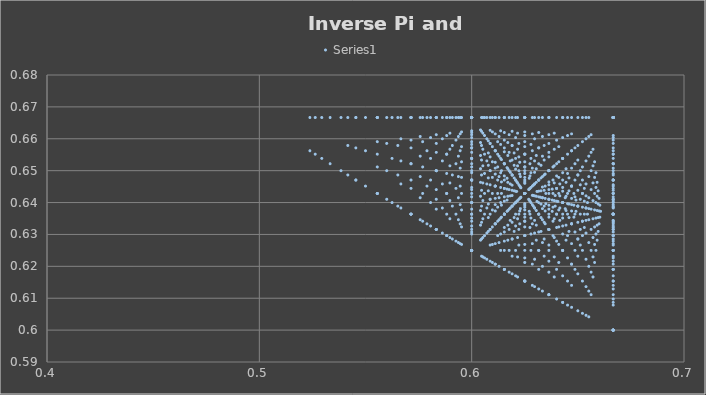
| Category | Series 0 |
|---|---|
| 0.6666666666666666 | 0.6 |
| 0.6 | 0.625 |
| 0.5714285714285714 | 0.636 |
| 0.5555555555555556 | 0.643 |
| 0.5454545454545455 | 0.647 |
| 0.5384615384615384 | 0.65 |
| 0.5333333333333333 | 0.652 |
| 0.5294117647058824 | 0.654 |
| 0.5263157894736842 | 0.655 |
| 0.5238095238095238 | 0.656 |
| 0.6666666666666666 | 0.6 |
| 0.625 | 0.615 |
| 0.6 | 0.625 |
| 0.5833333333333334 | 0.632 |
| 0.5714285714285714 | 0.636 |
| 0.5625 | 0.64 |
| 0.5555555555555556 | 0.643 |
| 0.55 | 0.645 |
| 0.5454545454545455 | 0.647 |
| 0.5416666666666666 | 0.649 |
| 0.6666666666666666 | 0.6 |
| 0.6363636363636364 | 0.611 |
| 0.6153846153846154 | 0.619 |
| 0.6 | 0.625 |
| 0.5882352941176471 | 0.63 |
| 0.5789473684210527 | 0.633 |
| 0.5714285714285714 | 0.636 |
| 0.5652173913043479 | 0.639 |
| 0.5599999999999999 | 0.641 |
| 0.5555555555555556 | 0.643 |
| 0.6666666666666666 | 0.6 |
| 0.6428571428571428 | 0.609 |
| 0.625 | 0.615 |
| 0.611111111111111 | 0.621 |
| 0.6 | 0.625 |
| 0.5909090909090909 | 0.629 |
| 0.5833333333333334 | 0.632 |
| 0.5769230769230769 | 0.634 |
| 0.5714285714285714 | 0.636 |
| 0.5666666666666667 | 0.638 |
| 0.6666666666666666 | 0.6 |
| 0.6470588235294118 | 0.607 |
| 0.6315789473684211 | 0.613 |
| 0.6190476190476191 | 0.618 |
| 0.6086956521739131 | 0.622 |
| 0.6 | 0.625 |
| 0.5925925925925926 | 0.628 |
| 0.5862068965517242 | 0.63 |
| 0.5806451612903225 | 0.633 |
| 0.5757575757575757 | 0.635 |
| 0.6666666666666666 | 0.6 |
| 0.6499999999999999 | 0.606 |
| 0.6363636363636364 | 0.611 |
| 0.625 | 0.615 |
| 0.6153846153846154 | 0.619 |
| 0.6071428571428572 | 0.622 |
| 0.6 | 0.625 |
| 0.59375 | 0.627 |
| 0.5882352941176471 | 0.63 |
| 0.5833333333333334 | 0.632 |
| 0.6666666666666666 | 0.6 |
| 0.6521739130434783 | 0.605 |
| 0.64 | 0.61 |
| 0.6296296296296297 | 0.614 |
| 0.6206896551724138 | 0.617 |
| 0.6129032258064516 | 0.62 |
| 0.6060606060606061 | 0.623 |
| 0.6 | 0.625 |
| 0.5945945945945946 | 0.627 |
| 0.5897435897435898 | 0.629 |
| 0.6666666666666666 | 0.6 |
| 0.6538461538461539 | 0.605 |
| 0.6428571428571428 | 0.609 |
| 0.6333333333333333 | 0.612 |
| 0.625 | 0.615 |
| 0.6176470588235294 | 0.618 |
| 0.611111111111111 | 0.621 |
| 0.6052631578947368 | 0.623 |
| 0.6 | 0.625 |
| 0.5952380952380952 | 0.627 |
| 0.6666666666666666 | 0.6 |
| 0.6551724137931034 | 0.604 |
| 0.6451612903225806 | 0.608 |
| 0.6363636363636364 | 0.611 |
| 0.6285714285714286 | 0.614 |
| 0.6216216216216216 | 0.617 |
| 0.6153846153846154 | 0.619 |
| 0.6097560975609756 | 0.621 |
| 0.6046511627906977 | 0.623 |
| 0.6 | 0.625 |
| 0.6666666666666666 | 0.667 |
| 0.6 | 0.667 |
| 0.5714285714285714 | 0.667 |
| 0.5555555555555556 | 0.667 |
| 0.5454545454545455 | 0.667 |
| 0.5384615384615384 | 0.667 |
| 0.5333333333333333 | 0.667 |
| 0.5294117647058824 | 0.667 |
| 0.5263157894736842 | 0.667 |
| 0.5238095238095238 | 0.667 |
| 0.6666666666666666 | 0.636 |
| 0.625 | 0.643 |
| 0.6 | 0.647 |
| 0.5833333333333334 | 0.65 |
| 0.5714285714285714 | 0.652 |
| 0.5625 | 0.654 |
| 0.5555555555555556 | 0.655 |
| 0.55 | 0.656 |
| 0.5454545454545455 | 0.657 |
| 0.5416666666666666 | 0.658 |
| 0.6666666666666666 | 0.625 |
| 0.6363636363636364 | 0.632 |
| 0.6153846153846154 | 0.636 |
| 0.6 | 0.64 |
| 0.5882352941176471 | 0.643 |
| 0.5789473684210527 | 0.645 |
| 0.5714285714285714 | 0.647 |
| 0.5652173913043479 | 0.649 |
| 0.5599999999999999 | 0.65 |
| 0.5555555555555556 | 0.651 |
| 0.6666666666666666 | 0.619 |
| 0.6428571428571428 | 0.625 |
| 0.625 | 0.63 |
| 0.611111111111111 | 0.633 |
| 0.6 | 0.636 |
| 0.5909090909090909 | 0.639 |
| 0.5833333333333334 | 0.641 |
| 0.5769230769230769 | 0.643 |
| 0.5714285714285714 | 0.644 |
| 0.5666666666666667 | 0.646 |
| 0.6666666666666666 | 0.615 |
| 0.6470588235294118 | 0.621 |
| 0.6315789473684211 | 0.625 |
| 0.6190476190476191 | 0.629 |
| 0.6086956521739131 | 0.632 |
| 0.6 | 0.634 |
| 0.5925925925925926 | 0.636 |
| 0.5862068965517242 | 0.638 |
| 0.5806451612903225 | 0.64 |
| 0.5757575757575757 | 0.642 |
| 0.6666666666666666 | 0.613 |
| 0.6499999999999999 | 0.618 |
| 0.6363636363636364 | 0.622 |
| 0.625 | 0.625 |
| 0.6153846153846154 | 0.628 |
| 0.6071428571428572 | 0.63 |
| 0.6 | 0.633 |
| 0.59375 | 0.635 |
| 0.5882352941176471 | 0.636 |
| 0.5833333333333334 | 0.638 |
| 0.6666666666666666 | 0.611 |
| 0.6521739130434783 | 0.615 |
| 0.64 | 0.619 |
| 0.6296296296296297 | 0.622 |
| 0.6206896551724138 | 0.625 |
| 0.6129032258064516 | 0.627 |
| 0.6060606060606061 | 0.63 |
| 0.6 | 0.632 |
| 0.5945945945945946 | 0.633 |
| 0.5897435897435898 | 0.635 |
| 0.6666666666666666 | 0.61 |
| 0.6538461538461539 | 0.614 |
| 0.6428571428571428 | 0.617 |
| 0.6333333333333333 | 0.62 |
| 0.625 | 0.623 |
| 0.6176470588235294 | 0.625 |
| 0.611111111111111 | 0.627 |
| 0.6052631578947368 | 0.629 |
| 0.6 | 0.631 |
| 0.5952380952380952 | 0.632 |
| 0.6666666666666666 | 0.609 |
| 0.6551724137931034 | 0.612 |
| 0.6451612903225806 | 0.615 |
| 0.6363636363636364 | 0.618 |
| 0.6285714285714286 | 0.621 |
| 0.6216216216216216 | 0.623 |
| 0.6153846153846154 | 0.625 |
| 0.6097560975609756 | 0.627 |
| 0.6046511627906977 | 0.629 |
| 0.6 | 0.63 |
| 0.6666666666666666 | 0.608 |
| 0.65625 | 0.611 |
| 0.6470588235294118 | 0.614 |
| 0.6388888888888888 | 0.617 |
| 0.6315789473684211 | 0.619 |
| 0.625 | 0.621 |
| 0.6190476190476191 | 0.623 |
| 0.6136363636363636 | 0.625 |
| 0.6086956521739131 | 0.627 |
| 0.6041666666666666 | 0.628 |
| 0.6666666666666666 | 0.667 |
| 0.625 | 0.667 |
| 0.6 | 0.667 |
| 0.5833333333333334 | 0.667 |
| 0.5714285714285714 | 0.667 |
| 0.5625 | 0.667 |
| 0.5555555555555556 | 0.667 |
| 0.55 | 0.667 |
| 0.5454545454545455 | 0.667 |
| 0.5416666666666666 | 0.667 |
| 0.6666666666666666 | 0.647 |
| 0.6363636363636364 | 0.65 |
| 0.6153846153846154 | 0.652 |
| 0.6 | 0.654 |
| 0.5882352941176471 | 0.655 |
| 0.5789473684210527 | 0.656 |
| 0.5714285714285714 | 0.657 |
| 0.5652173913043479 | 0.658 |
| 0.5599999999999999 | 0.659 |
| 0.5555555555555556 | 0.659 |
| 0.6666666666666666 | 0.636 |
| 0.6428571428571428 | 0.64 |
| 0.625 | 0.643 |
| 0.611111111111111 | 0.645 |
| 0.6 | 0.647 |
| 0.5909090909090909 | 0.649 |
| 0.5833333333333334 | 0.65 |
| 0.5769230769230769 | 0.651 |
| 0.5714285714285714 | 0.652 |
| 0.5666666666666667 | 0.653 |
| 0.6666666666666666 | 0.63 |
| 0.6470588235294118 | 0.633 |
| 0.6315789473684211 | 0.636 |
| 0.6190476190476191 | 0.639 |
| 0.6086956521739131 | 0.641 |
| 0.6 | 0.643 |
| 0.5925925925925926 | 0.644 |
| 0.5862068965517242 | 0.646 |
| 0.5806451612903225 | 0.647 |
| 0.5757575757575757 | 0.648 |
| 0.6666666666666666 | 0.625 |
| 0.6499999999999999 | 0.629 |
| 0.6363636363636364 | 0.632 |
| 0.625 | 0.634 |
| 0.6153846153846154 | 0.636 |
| 0.6071428571428572 | 0.638 |
| 0.6 | 0.64 |
| 0.59375 | 0.642 |
| 0.5882352941176471 | 0.643 |
| 0.5833333333333334 | 0.644 |
| 0.6666666666666666 | 0.622 |
| 0.6521739130434783 | 0.625 |
| 0.64 | 0.628 |
| 0.6296296296296297 | 0.63 |
| 0.6206896551724138 | 0.633 |
| 0.6129032258064516 | 0.635 |
| 0.6060606060606061 | 0.636 |
| 0.6 | 0.638 |
| 0.5945945945945946 | 0.639 |
| 0.5897435897435898 | 0.641 |
| 0.6666666666666666 | 0.619 |
| 0.6538461538461539 | 0.622 |
| 0.6428571428571428 | 0.625 |
| 0.6333333333333333 | 0.627 |
| 0.625 | 0.63 |
| 0.6176470588235294 | 0.632 |
| 0.611111111111111 | 0.633 |
| 0.6052631578947368 | 0.635 |
| 0.6 | 0.636 |
| 0.5952380952380952 | 0.638 |
| 0.6666666666666666 | 0.617 |
| 0.6551724137931034 | 0.62 |
| 0.6451612903225806 | 0.623 |
| 0.6363636363636364 | 0.625 |
| 0.6285714285714286 | 0.627 |
| 0.6216216216216216 | 0.629 |
| 0.6153846153846154 | 0.631 |
| 0.6097560975609756 | 0.632 |
| 0.6046511627906977 | 0.634 |
| 0.6 | 0.635 |
| 0.6666666666666666 | 0.615 |
| 0.65625 | 0.618 |
| 0.6470588235294118 | 0.621 |
| 0.6388888888888888 | 0.623 |
| 0.6315789473684211 | 0.625 |
| 0.625 | 0.627 |
| 0.6190476190476191 | 0.629 |
| 0.6136363636363636 | 0.63 |
| 0.6086956521739131 | 0.632 |
| 0.6041666666666666 | 0.633 |
| 0.6666666666666666 | 0.614 |
| 0.6571428571428571 | 0.617 |
| 0.6486486486486486 | 0.619 |
| 0.641025641025641 | 0.621 |
| 0.6341463414634146 | 0.623 |
| 0.627906976744186 | 0.625 |
| 0.6222222222222222 | 0.627 |
| 0.6170212765957447 | 0.628 |
| 0.6122448979591837 | 0.63 |
| 0.6078431372549019 | 0.631 |
| 0.6666666666666666 | 0.667 |
| 0.6363636363636364 | 0.667 |
| 0.6153846153846154 | 0.667 |
| 0.6 | 0.667 |
| 0.5882352941176471 | 0.667 |
| 0.5789473684210527 | 0.667 |
| 0.5714285714285714 | 0.667 |
| 0.5652173913043479 | 0.667 |
| 0.5599999999999999 | 0.667 |
| 0.5555555555555556 | 0.667 |
| 0.6666666666666666 | 0.652 |
| 0.6428571428571428 | 0.654 |
| 0.625 | 0.655 |
| 0.611111111111111 | 0.656 |
| 0.6 | 0.657 |
| 0.5909090909090909 | 0.658 |
| 0.5833333333333334 | 0.659 |
| 0.5769230769230769 | 0.659 |
| 0.5714285714285714 | 0.66 |
| 0.5666666666666667 | 0.66 |
| 0.6666666666666666 | 0.643 |
| 0.6470588235294118 | 0.645 |
| 0.6315789473684211 | 0.647 |
| 0.6190476190476191 | 0.649 |
| 0.6086956521739131 | 0.65 |
| 0.6 | 0.651 |
| 0.5925925925925926 | 0.652 |
| 0.5862068965517242 | 0.653 |
| 0.5806451612903225 | 0.654 |
| 0.5757575757575757 | 0.655 |
| 0.6666666666666666 | 0.636 |
| 0.6499999999999999 | 0.639 |
| 0.6363636363636364 | 0.641 |
| 0.625 | 0.643 |
| 0.6153846153846154 | 0.644 |
| 0.6071428571428572 | 0.646 |
| 0.6 | 0.647 |
| 0.59375 | 0.648 |
| 0.5882352941176471 | 0.649 |
| 0.5833333333333334 | 0.65 |
| 0.6666666666666666 | 0.632 |
| 0.6521739130434783 | 0.634 |
| 0.64 | 0.636 |
| 0.6296296296296297 | 0.638 |
| 0.6206896551724138 | 0.64 |
| 0.6129032258064516 | 0.642 |
| 0.6060606060606061 | 0.643 |
| 0.6 | 0.644 |
| 0.5945945945945946 | 0.645 |
| 0.5897435897435898 | 0.646 |
| 0.6666666666666666 | 0.628 |
| 0.6538461538461539 | 0.63 |
| 0.6428571428571428 | 0.633 |
| 0.6333333333333333 | 0.635 |
| 0.625 | 0.636 |
| 0.6176470588235294 | 0.638 |
| 0.611111111111111 | 0.639 |
| 0.6052631578947368 | 0.641 |
| 0.6 | 0.642 |
| 0.5952380952380952 | 0.643 |
| 0.6666666666666666 | 0.625 |
| 0.6551724137931034 | 0.627 |
| 0.6451612903225806 | 0.63 |
| 0.6363636363636364 | 0.632 |
| 0.6285714285714286 | 0.633 |
| 0.6216216216216216 | 0.635 |
| 0.6153846153846154 | 0.636 |
| 0.6097560975609756 | 0.638 |
| 0.6046511627906977 | 0.639 |
| 0.6 | 0.64 |
| 0.6666666666666666 | 0.623 |
| 0.65625 | 0.625 |
| 0.6470588235294118 | 0.627 |
| 0.6388888888888888 | 0.629 |
| 0.6315789473684211 | 0.631 |
| 0.625 | 0.632 |
| 0.6190476190476191 | 0.634 |
| 0.6136363636363636 | 0.635 |
| 0.6086956521739131 | 0.636 |
| 0.6041666666666666 | 0.638 |
| 0.6666666666666666 | 0.621 |
| 0.6571428571428571 | 0.623 |
| 0.6486486486486486 | 0.625 |
| 0.641025641025641 | 0.627 |
| 0.6341463414634146 | 0.629 |
| 0.627906976744186 | 0.63 |
| 0.6222222222222222 | 0.632 |
| 0.6170212765957447 | 0.633 |
| 0.6122448979591837 | 0.634 |
| 0.6078431372549019 | 0.635 |
| 0.6666666666666666 | 0.619 |
| 0.6578947368421053 | 0.621 |
| 0.6499999999999999 | 0.623 |
| 0.6428571428571428 | 0.625 |
| 0.6363636363636364 | 0.627 |
| 0.6304347826086957 | 0.628 |
| 0.625 | 0.63 |
| 0.62 | 0.631 |
| 0.6153846153846154 | 0.632 |
| 0.611111111111111 | 0.633 |
| 0.6666666666666666 | 0.667 |
| 0.6428571428571428 | 0.667 |
| 0.625 | 0.667 |
| 0.611111111111111 | 0.667 |
| 0.6 | 0.667 |
| 0.5909090909090909 | 0.667 |
| 0.5833333333333334 | 0.667 |
| 0.5769230769230769 | 0.667 |
| 0.5714285714285714 | 0.667 |
| 0.5666666666666667 | 0.667 |
| 0.6666666666666666 | 0.655 |
| 0.6470588235294118 | 0.656 |
| 0.6315789473684211 | 0.657 |
| 0.6190476190476191 | 0.658 |
| 0.6086956521739131 | 0.659 |
| 0.6 | 0.659 |
| 0.5925925925925926 | 0.66 |
| 0.5862068965517242 | 0.66 |
| 0.5806451612903225 | 0.66 |
| 0.5757575757575757 | 0.661 |
| 0.6666666666666666 | 0.647 |
| 0.6499999999999999 | 0.649 |
| 0.6363636363636364 | 0.65 |
| 0.625 | 0.651 |
| 0.6153846153846154 | 0.652 |
| 0.6071428571428572 | 0.653 |
| 0.6 | 0.654 |
| 0.59375 | 0.655 |
| 0.5882352941176471 | 0.655 |
| 0.5833333333333334 | 0.656 |
| 0.6666666666666666 | 0.641 |
| 0.6521739130434783 | 0.643 |
| 0.64 | 0.644 |
| 0.6296296296296297 | 0.646 |
| 0.6206896551724138 | 0.647 |
| 0.6129032258064516 | 0.648 |
| 0.6060606060606061 | 0.649 |
| 0.6 | 0.65 |
| 0.5945945945945946 | 0.651 |
| 0.5897435897435898 | 0.652 |
| 0.6666666666666666 | 0.636 |
| 0.6538461538461539 | 0.638 |
| 0.6428571428571428 | 0.64 |
| 0.6333333333333333 | 0.642 |
| 0.625 | 0.643 |
| 0.6176470588235294 | 0.644 |
| 0.611111111111111 | 0.645 |
| 0.6052631578947368 | 0.646 |
| 0.6 | 0.647 |
| 0.5952380952380952 | 0.648 |
| 0.6666666666666666 | 0.633 |
| 0.6551724137931034 | 0.635 |
| 0.6451612903225806 | 0.636 |
| 0.6363636363636364 | 0.638 |
| 0.6285714285714286 | 0.639 |
| 0.6216216216216216 | 0.641 |
| 0.6153846153846154 | 0.642 |
| 0.6097560975609756 | 0.643 |
| 0.6046511627906977 | 0.644 |
| 0.6 | 0.645 |
| 0.6666666666666666 | 0.63 |
| 0.65625 | 0.632 |
| 0.6470588235294118 | 0.633 |
| 0.6388888888888888 | 0.635 |
| 0.6315789473684211 | 0.636 |
| 0.625 | 0.638 |
| 0.6190476190476191 | 0.639 |
| 0.6136363636363636 | 0.64 |
| 0.6086956521739131 | 0.641 |
| 0.6041666666666666 | 0.642 |
| 0.6666666666666666 | 0.627 |
| 0.6571428571428571 | 0.629 |
| 0.6486486486486486 | 0.631 |
| 0.641025641025641 | 0.632 |
| 0.6341463414634146 | 0.634 |
| 0.627906976744186 | 0.635 |
| 0.6222222222222222 | 0.636 |
| 0.6170212765957447 | 0.638 |
| 0.6122448979591837 | 0.639 |
| 0.6078431372549019 | 0.64 |
| 0.6666666666666666 | 0.625 |
| 0.6578947368421053 | 0.627 |
| 0.6499999999999999 | 0.629 |
| 0.6428571428571428 | 0.63 |
| 0.6363636363636364 | 0.632 |
| 0.6304347826086957 | 0.633 |
| 0.625 | 0.634 |
| 0.62 | 0.635 |
| 0.6153846153846154 | 0.636 |
| 0.611111111111111 | 0.637 |
| 0.6666666666666666 | 0.623 |
| 0.6585365853658536 | 0.625 |
| 0.6511627906976744 | 0.627 |
| 0.6444444444444445 | 0.628 |
| 0.6382978723404256 | 0.63 |
| 0.6326530612244898 | 0.631 |
| 0.6274509803921569 | 0.632 |
| 0.6226415094339623 | 0.633 |
| 0.6181818181818182 | 0.634 |
| 0.6140350877192983 | 0.635 |
| 0.6666666666666666 | 0.667 |
| 0.6470588235294118 | 0.667 |
| 0.6315789473684211 | 0.667 |
| 0.6190476190476191 | 0.667 |
| 0.6086956521739131 | 0.667 |
| 0.6 | 0.667 |
| 0.5925925925925926 | 0.667 |
| 0.5862068965517242 | 0.667 |
| 0.5806451612903225 | 0.667 |
| 0.5757575757575757 | 0.667 |
| 0.6666666666666666 | 0.657 |
| 0.6499999999999999 | 0.658 |
| 0.6363636363636364 | 0.659 |
| 0.625 | 0.659 |
| 0.6153846153846154 | 0.66 |
| 0.6071428571428572 | 0.66 |
| 0.6 | 0.66 |
| 0.59375 | 0.661 |
| 0.5882352941176471 | 0.661 |
| 0.5833333333333334 | 0.661 |
| 0.6666666666666666 | 0.65 |
| 0.6521739130434783 | 0.651 |
| 0.64 | 0.652 |
| 0.6296296296296297 | 0.653 |
| 0.6206896551724138 | 0.654 |
| 0.6129032258064516 | 0.655 |
| 0.6060606060606061 | 0.655 |
| 0.6 | 0.656 |
| 0.5945945945945946 | 0.656 |
| 0.5897435897435898 | 0.657 |
| 0.6666666666666666 | 0.644 |
| 0.6538461538461539 | 0.646 |
| 0.6428571428571428 | 0.647 |
| 0.6333333333333333 | 0.648 |
| 0.625 | 0.649 |
| 0.6176470588235294 | 0.65 |
| 0.611111111111111 | 0.651 |
| 0.6052631578947368 | 0.652 |
| 0.6 | 0.652 |
| 0.5952380952380952 | 0.653 |
| 0.6666666666666666 | 0.64 |
| 0.6551724137931034 | 0.642 |
| 0.6451612903225806 | 0.643 |
| 0.6363636363636364 | 0.644 |
| 0.6285714285714286 | 0.645 |
| 0.6216216216216216 | 0.646 |
| 0.6153846153846154 | 0.647 |
| 0.6097560975609756 | 0.648 |
| 0.6046511627906977 | 0.649 |
| 0.6 | 0.649 |
| 0.6666666666666666 | 0.636 |
| 0.65625 | 0.638 |
| 0.6470588235294118 | 0.639 |
| 0.6388888888888888 | 0.641 |
| 0.6315789473684211 | 0.642 |
| 0.625 | 0.643 |
| 0.6190476190476191 | 0.644 |
| 0.6136363636363636 | 0.645 |
| 0.6086956521739131 | 0.646 |
| 0.6041666666666666 | 0.646 |
| 0.6666666666666666 | 0.633 |
| 0.6571428571428571 | 0.635 |
| 0.6486486486486486 | 0.636 |
| 0.641025641025641 | 0.638 |
| 0.6341463414634146 | 0.639 |
| 0.627906976744186 | 0.64 |
| 0.6222222222222222 | 0.641 |
| 0.6170212765957447 | 0.642 |
| 0.6122448979591837 | 0.643 |
| 0.6078431372549019 | 0.644 |
| 0.6666666666666666 | 0.631 |
| 0.6578947368421053 | 0.632 |
| 0.6499999999999999 | 0.634 |
| 0.6428571428571428 | 0.635 |
| 0.6363636363636364 | 0.636 |
| 0.6304347826086957 | 0.638 |
| 0.625 | 0.639 |
| 0.62 | 0.64 |
| 0.6153846153846154 | 0.64 |
| 0.611111111111111 | 0.641 |
| 0.6666666666666666 | 0.629 |
| 0.6585365853658536 | 0.63 |
| 0.6511627906976744 | 0.632 |
| 0.6444444444444445 | 0.633 |
| 0.6382978723404256 | 0.634 |
| 0.6326530612244898 | 0.635 |
| 0.6274509803921569 | 0.636 |
| 0.6226415094339623 | 0.637 |
| 0.6181818181818182 | 0.638 |
| 0.6140350877192983 | 0.639 |
| 0.6666666666666666 | 0.627 |
| 0.6590909090909092 | 0.628 |
| 0.6521739130434783 | 0.63 |
| 0.6458333333333334 | 0.631 |
| 0.64 | 0.632 |
| 0.6346153846153847 | 0.633 |
| 0.6296296296296297 | 0.634 |
| 0.625 | 0.635 |
| 0.6206896551724138 | 0.636 |
| 0.6166666666666666 | 0.637 |
| 0.6666666666666666 | 0.667 |
| 0.6499999999999999 | 0.667 |
| 0.6363636363636364 | 0.667 |
| 0.625 | 0.667 |
| 0.6153846153846154 | 0.667 |
| 0.6071428571428572 | 0.667 |
| 0.6 | 0.667 |
| 0.59375 | 0.667 |
| 0.5882352941176471 | 0.667 |
| 0.5833333333333334 | 0.667 |
| 0.6666666666666666 | 0.659 |
| 0.6521739130434783 | 0.659 |
| 0.64 | 0.66 |
| 0.6296296296296297 | 0.66 |
| 0.6206896551724138 | 0.66 |
| 0.6129032258064516 | 0.661 |
| 0.6060606060606061 | 0.661 |
| 0.6 | 0.661 |
| 0.5945945945945946 | 0.662 |
| 0.5897435897435898 | 0.662 |
| 0.6666666666666666 | 0.652 |
| 0.6538461538461539 | 0.653 |
| 0.6428571428571428 | 0.654 |
| 0.6333333333333333 | 0.655 |
| 0.625 | 0.655 |
| 0.6176470588235294 | 0.656 |
| 0.611111111111111 | 0.656 |
| 0.6052631578947368 | 0.657 |
| 0.6 | 0.657 |
| 0.5952380952380952 | 0.658 |
| 0.6666666666666666 | 0.647 |
| 0.6551724137931034 | 0.648 |
| 0.6451612903225806 | 0.649 |
| 0.6363636363636364 | 0.65 |
| 0.6285714285714286 | 0.651 |
| 0.6216216216216216 | 0.652 |
| 0.6153846153846154 | 0.652 |
| 0.6097560975609756 | 0.653 |
| 0.6046511627906977 | 0.653 |
| 0.6 | 0.654 |
| 0.6666666666666666 | 0.643 |
| 0.65625 | 0.644 |
| 0.6470588235294118 | 0.645 |
| 0.6388888888888888 | 0.646 |
| 0.6315789473684211 | 0.647 |
| 0.625 | 0.648 |
| 0.6190476190476191 | 0.649 |
| 0.6136363636363636 | 0.649 |
| 0.6086956521739131 | 0.65 |
| 0.6041666666666666 | 0.651 |
| 0.6666666666666666 | 0.639 |
| 0.6571428571428571 | 0.641 |
| 0.6486486486486486 | 0.642 |
| 0.641025641025641 | 0.643 |
| 0.6341463414634146 | 0.644 |
| 0.627906976744186 | 0.645 |
| 0.6222222222222222 | 0.646 |
| 0.6170212765957447 | 0.646 |
| 0.6122448979591837 | 0.647 |
| 0.6078431372549019 | 0.648 |
| 0.6666666666666666 | 0.636 |
| 0.6578947368421053 | 0.638 |
| 0.6499999999999999 | 0.639 |
| 0.6428571428571428 | 0.64 |
| 0.6363636363636364 | 0.641 |
| 0.6304347826086957 | 0.642 |
| 0.625 | 0.643 |
| 0.62 | 0.644 |
| 0.6153846153846154 | 0.644 |
| 0.611111111111111 | 0.645 |
| 0.6666666666666666 | 0.634 |
| 0.6585365853658536 | 0.635 |
| 0.6511627906976744 | 0.636 |
| 0.6444444444444445 | 0.638 |
| 0.6382978723404256 | 0.639 |
| 0.6326530612244898 | 0.64 |
| 0.6274509803921569 | 0.64 |
| 0.6226415094339623 | 0.641 |
| 0.6181818181818182 | 0.642 |
| 0.6140350877192983 | 0.643 |
| 0.6666666666666666 | 0.632 |
| 0.6590909090909092 | 0.633 |
| 0.6521739130434783 | 0.634 |
| 0.6458333333333334 | 0.635 |
| 0.64 | 0.636 |
| 0.6346153846153847 | 0.637 |
| 0.6296296296296297 | 0.638 |
| 0.625 | 0.639 |
| 0.6206896551724138 | 0.64 |
| 0.6166666666666666 | 0.641 |
| 0.6666666666666666 | 0.63 |
| 0.6595744680851063 | 0.631 |
| 0.6530612244897959 | 0.632 |
| 0.6470588235294118 | 0.633 |
| 0.6415094339622641 | 0.634 |
| 0.6363636363636364 | 0.635 |
| 0.6315789473684211 | 0.636 |
| 0.6271186440677966 | 0.637 |
| 0.6229508196721311 | 0.638 |
| 0.6190476190476191 | 0.639 |
| 0.6666666666666666 | 0.667 |
| 0.6521739130434783 | 0.667 |
| 0.64 | 0.667 |
| 0.6296296296296297 | 0.667 |
| 0.6206896551724138 | 0.667 |
| 0.6129032258064516 | 0.667 |
| 0.6060606060606061 | 0.667 |
| 0.6 | 0.667 |
| 0.5945945945945946 | 0.667 |
| 0.5897435897435898 | 0.667 |
| 0.6666666666666666 | 0.66 |
| 0.6538461538461539 | 0.66 |
| 0.6428571428571428 | 0.66 |
| 0.6333333333333333 | 0.661 |
| 0.625 | 0.661 |
| 0.6176470588235294 | 0.661 |
| 0.611111111111111 | 0.662 |
| 0.6052631578947368 | 0.662 |
| 0.6 | 0.662 |
| 0.5952380952380952 | 0.662 |
| 0.6666666666666666 | 0.654 |
| 0.6551724137931034 | 0.655 |
| 0.6451612903225806 | 0.655 |
| 0.6363636363636364 | 0.656 |
| 0.6285714285714286 | 0.656 |
| 0.6216216216216216 | 0.657 |
| 0.6153846153846154 | 0.657 |
| 0.6097560975609756 | 0.658 |
| 0.6046511627906977 | 0.658 |
| 0.6 | 0.658 |
| 0.6666666666666666 | 0.649 |
| 0.65625 | 0.65 |
| 0.6470588235294118 | 0.651 |
| 0.6388888888888888 | 0.652 |
| 0.6315789473684211 | 0.652 |
| 0.625 | 0.653 |
| 0.6190476190476191 | 0.653 |
| 0.6136363636363636 | 0.654 |
| 0.6086956521739131 | 0.654 |
| 0.6041666666666666 | 0.655 |
| 0.6666666666666666 | 0.645 |
| 0.6571428571428571 | 0.646 |
| 0.6486486486486486 | 0.647 |
| 0.641025641025641 | 0.648 |
| 0.6341463414634146 | 0.649 |
| 0.627906976744186 | 0.649 |
| 0.6222222222222222 | 0.65 |
| 0.6170212765957447 | 0.651 |
| 0.6122448979591837 | 0.651 |
| 0.6078431372549019 | 0.652 |
| 0.6666666666666666 | 0.642 |
| 0.6578947368421053 | 0.643 |
| 0.6499999999999999 | 0.644 |
| 0.6428571428571428 | 0.645 |
| 0.6363636363636364 | 0.646 |
| 0.6304347826086957 | 0.646 |
| 0.625 | 0.647 |
| 0.62 | 0.648 |
| 0.6153846153846154 | 0.648 |
| 0.611111111111111 | 0.649 |
| 0.6666666666666666 | 0.639 |
| 0.6585365853658536 | 0.64 |
| 0.6511627906976744 | 0.641 |
| 0.6444444444444445 | 0.642 |
| 0.6382978723404256 | 0.643 |
| 0.6326530612244898 | 0.644 |
| 0.6274509803921569 | 0.644 |
| 0.6226415094339623 | 0.645 |
| 0.6181818181818182 | 0.646 |
| 0.6140350877192983 | 0.646 |
| 0.6666666666666666 | 0.636 |
| 0.6590909090909092 | 0.638 |
| 0.6521739130434783 | 0.639 |
| 0.6458333333333334 | 0.64 |
| 0.64 | 0.64 |
| 0.6346153846153847 | 0.641 |
| 0.6296296296296297 | 0.642 |
| 0.625 | 0.643 |
| 0.6206896551724138 | 0.644 |
| 0.6166666666666666 | 0.644 |
| 0.6666666666666666 | 0.634 |
| 0.6595744680851063 | 0.635 |
| 0.6530612244897959 | 0.636 |
| 0.6470588235294118 | 0.637 |
| 0.6415094339622641 | 0.638 |
| 0.6363636363636364 | 0.639 |
| 0.6315789473684211 | 0.64 |
| 0.6271186440677966 | 0.641 |
| 0.6229508196721311 | 0.642 |
| 0.6190476190476191 | 0.642 |
| 0.6666666666666666 | 0.632 |
| 0.66 | 0.633 |
| 0.6538461538461539 | 0.634 |
| 0.6481481481481481 | 0.635 |
| 0.6428571428571428 | 0.636 |
| 0.6379310344827587 | 0.637 |
| 0.6333333333333333 | 0.638 |
| 0.6290322580645161 | 0.639 |
| 0.625 | 0.64 |
| 0.6212121212121212 | 0.64 |
| 0.6666666666666666 | 0.667 |
| 0.6538461538461539 | 0.667 |
| 0.6428571428571428 | 0.667 |
| 0.6333333333333333 | 0.667 |
| 0.625 | 0.667 |
| 0.6176470588235294 | 0.667 |
| 0.611111111111111 | 0.667 |
| 0.6052631578947368 | 0.667 |
| 0.6 | 0.667 |
| 0.5952380952380952 | 0.667 |
| 0.6666666666666666 | 0.66 |
| 0.6551724137931034 | 0.661 |
| 0.6451612903225806 | 0.661 |
| 0.6363636363636364 | 0.661 |
| 0.6285714285714286 | 0.662 |
| 0.6216216216216216 | 0.662 |
| 0.6153846153846154 | 0.662 |
| 0.6097560975609756 | 0.662 |
| 0.6046511627906977 | 0.662 |
| 0.6 | 0.662 |
| 0.6666666666666666 | 0.655 |
| 0.65625 | 0.656 |
| 0.6470588235294118 | 0.656 |
| 0.6388888888888888 | 0.657 |
| 0.6315789473684211 | 0.657 |
| 0.625 | 0.658 |
| 0.6190476190476191 | 0.658 |
| 0.6136363636363636 | 0.658 |
| 0.6086956521739131 | 0.659 |
| 0.6041666666666666 | 0.659 |
| 0.6666666666666666 | 0.651 |
| 0.6571428571428571 | 0.652 |
| 0.6486486486486486 | 0.652 |
| 0.641025641025641 | 0.653 |
| 0.6341463414634146 | 0.653 |
| 0.627906976744186 | 0.654 |
| 0.6222222222222222 | 0.654 |
| 0.6170212765957447 | 0.655 |
| 0.6122448979591837 | 0.655 |
| 0.6078431372549019 | 0.656 |
| 0.6666666666666666 | 0.647 |
| 0.6578947368421053 | 0.648 |
| 0.6499999999999999 | 0.649 |
| 0.6428571428571428 | 0.649 |
| 0.6363636363636364 | 0.65 |
| 0.6304347826086957 | 0.651 |
| 0.625 | 0.651 |
| 0.62 | 0.652 |
| 0.6153846153846154 | 0.652 |
| 0.611111111111111 | 0.653 |
| 0.6666666666666666 | 0.644 |
| 0.6585365853658536 | 0.645 |
| 0.6511627906976744 | 0.646 |
| 0.6444444444444445 | 0.646 |
| 0.6382978723404256 | 0.647 |
| 0.6326530612244898 | 0.648 |
| 0.6274509803921569 | 0.648 |
| 0.6226415094339623 | 0.649 |
| 0.6181818181818182 | 0.649 |
| 0.6140350877192983 | 0.65 |
| 0.6666666666666666 | 0.641 |
| 0.6590909090909092 | 0.642 |
| 0.6521739130434783 | 0.643 |
| 0.6458333333333334 | 0.644 |
| 0.64 | 0.644 |
| 0.6346153846153847 | 0.645 |
| 0.6296296296296297 | 0.646 |
| 0.625 | 0.646 |
| 0.6206896551724138 | 0.647 |
| 0.6166666666666666 | 0.648 |
| 0.6666666666666666 | 0.639 |
| 0.6595744680851063 | 0.64 |
| 0.6530612244897959 | 0.64 |
| 0.6470588235294118 | 0.641 |
| 0.6415094339622641 | 0.642 |
| 0.6363636363636364 | 0.643 |
| 0.6315789473684211 | 0.644 |
| 0.6271186440677966 | 0.644 |
| 0.6229508196721311 | 0.645 |
| 0.6190476190476191 | 0.645 |
| 0.6666666666666666 | 0.636 |
| 0.66 | 0.637 |
| 0.6538461538461539 | 0.638 |
| 0.6481481481481481 | 0.639 |
| 0.6428571428571428 | 0.64 |
| 0.6379310344827587 | 0.641 |
| 0.6333333333333333 | 0.642 |
| 0.6290322580645161 | 0.642 |
| 0.625 | 0.643 |
| 0.6212121212121212 | 0.643 |
| 0.6666666666666666 | 0.634 |
| 0.6603773584905661 | 0.635 |
| 0.6545454545454545 | 0.636 |
| 0.6491228070175439 | 0.637 |
| 0.6440677966101696 | 0.638 |
| 0.639344262295082 | 0.639 |
| 0.6349206349206349 | 0.64 |
| 0.6307692307692307 | 0.64 |
| 0.626865671641791 | 0.641 |
| 0.6231884057971014 | 0.642 |
| 0.6666666666666666 | 0.667 |
| 0.6551724137931034 | 0.667 |
| 0.6451612903225806 | 0.667 |
| 0.6363636363636364 | 0.667 |
| 0.6285714285714286 | 0.667 |
| 0.6216216216216216 | 0.667 |
| 0.6153846153846154 | 0.667 |
| 0.6097560975609756 | 0.667 |
| 0.6046511627906977 | 0.667 |
| 0.6 | 0.667 |
| 0.6666666666666666 | 0.661 |
| 0.65625 | 0.661 |
| 0.6470588235294118 | 0.662 |
| 0.6388888888888888 | 0.662 |
| 0.6315789473684211 | 0.662 |
| 0.625 | 0.662 |
| 0.6190476190476191 | 0.662 |
| 0.6136363636363636 | 0.662 |
| 0.6086956521739131 | 0.663 |
| 0.6041666666666666 | 0.663 |
| 0.6666666666666666 | 0.656 |
| 0.6571428571428571 | 0.657 |
| 0.6486486486486486 | 0.657 |
| 0.641025641025641 | 0.658 |
| 0.6341463414634146 | 0.658 |
| 0.627906976744186 | 0.658 |
| 0.6222222222222222 | 0.659 |
| 0.6170212765957447 | 0.659 |
| 0.6122448979591837 | 0.659 |
| 0.6078431372549019 | 0.659 |
| 0.6666666666666666 | 0.652 |
| 0.6578947368421053 | 0.653 |
| 0.6499999999999999 | 0.653 |
| 0.6428571428571428 | 0.654 |
| 0.6363636363636364 | 0.654 |
| 0.6304347826086957 | 0.655 |
| 0.625 | 0.655 |
| 0.62 | 0.656 |
| 0.6153846153846154 | 0.656 |
| 0.611111111111111 | 0.656 |
| 0.6666666666666666 | 0.649 |
| 0.6585365853658536 | 0.649 |
| 0.6511627906976744 | 0.65 |
| 0.6444444444444445 | 0.651 |
| 0.6382978723404256 | 0.651 |
| 0.6326530612244898 | 0.652 |
| 0.6274509803921569 | 0.652 |
| 0.6226415094339623 | 0.653 |
| 0.6181818181818182 | 0.653 |
| 0.6140350877192983 | 0.653 |
| 0.6666666666666666 | 0.646 |
| 0.6590909090909092 | 0.646 |
| 0.6521739130434783 | 0.647 |
| 0.6458333333333334 | 0.648 |
| 0.64 | 0.648 |
| 0.6346153846153847 | 0.649 |
| 0.6296296296296297 | 0.649 |
| 0.625 | 0.65 |
| 0.6206896551724138 | 0.65 |
| 0.6166666666666666 | 0.651 |
| 0.6666666666666666 | 0.643 |
| 0.6595744680851063 | 0.644 |
| 0.6530612244897959 | 0.644 |
| 0.6470588235294118 | 0.645 |
| 0.6415094339622641 | 0.646 |
| 0.6363636363636364 | 0.646 |
| 0.6315789473684211 | 0.647 |
| 0.6271186440677966 | 0.648 |
| 0.6229508196721311 | 0.648 |
| 0.6190476190476191 | 0.649 |
| 0.6666666666666666 | 0.64 |
| 0.66 | 0.641 |
| 0.6538461538461539 | 0.642 |
| 0.6481481481481481 | 0.643 |
| 0.6428571428571428 | 0.644 |
| 0.6379310344827587 | 0.644 |
| 0.6333333333333333 | 0.645 |
| 0.6290322580645161 | 0.645 |
| 0.625 | 0.646 |
| 0.6212121212121212 | 0.647 |
| 0.6666666666666666 | 0.638 |
| 0.6603773584905661 | 0.639 |
| 0.6545454545454545 | 0.64 |
| 0.6491228070175439 | 0.641 |
| 0.6440677966101696 | 0.642 |
| 0.639344262295082 | 0.642 |
| 0.6349206349206349 | 0.643 |
| 0.6307692307692307 | 0.643 |
| 0.626865671641791 | 0.644 |
| 0.6231884057971014 | 0.645 |
| 0.6666666666666666 | 0.636 |
| 0.6607142857142857 | 0.637 |
| 0.6551724137931034 | 0.638 |
| 0.6499999999999999 | 0.639 |
| 0.6451612903225806 | 0.64 |
| 0.640625 | 0.64 |
| 0.6363636363636364 | 0.641 |
| 0.6323529411764707 | 0.642 |
| 0.6285714285714286 | 0.642 |
| 0.625 | 0.643 |